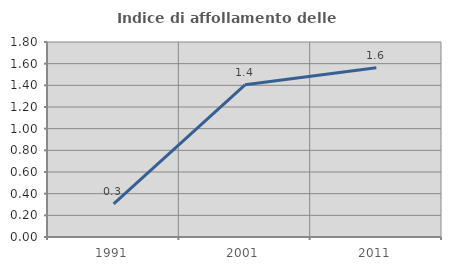
| Category | Indice di affollamento delle abitazioni  |
|---|---|
| 1991.0 | 0.306 |
| 2001.0 | 1.404 |
| 2011.0 | 1.562 |